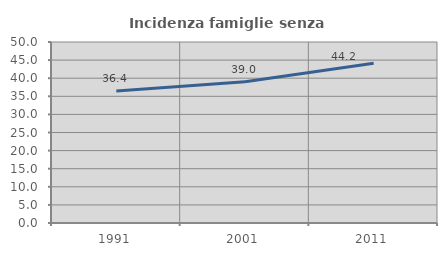
| Category | Incidenza famiglie senza nuclei |
|---|---|
| 1991.0 | 36.449 |
| 2001.0 | 38.989 |
| 2011.0 | 44.156 |